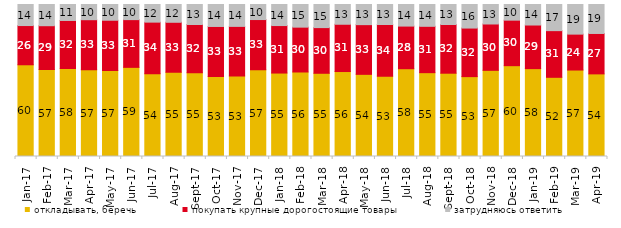
| Category | откладывать, беречь | покупать крупные дорогостоящие товары | затрудняюсь ответить |
|---|---|---|---|
| 2017-01-01 | 60.35 | 25.8 | 13.85 |
| 2017-02-01 | 56.8 | 28.6 | 13.85 |
| 2017-03-01 | 57.9 | 31.6 | 10.5 |
| 2017-04-01 | 57.1 | 32.85 | 10 |
| 2017-05-01 | 56.6 | 33.05 | 10.35 |
| 2017-06-01 | 58.65 | 31.4 | 9.95 |
| 2017-07-01 | 54.4 | 34 | 11.6 |
| 2017-08-01 | 55.4 | 32.9 | 11.7 |
| 2017-09-01 | 55.1 | 31.75 | 13.15 |
| 2017-10-01 | 52.6 | 32.95 | 14.45 |
| 2017-11-01 | 52.9 | 32.7 | 14.4 |
| 2017-12-01 | 57.1 | 33 | 9.9 |
| 2018-01-01 | 54.9 | 31.25 | 13.85 |
| 2018-02-01 | 55.6 | 29.5 | 14.9 |
| 2018-03-01 | 54.75 | 30.05 | 15.2 |
| 2018-04-01 | 55.9 | 31.1 | 13 |
| 2018-05-01 | 54.05 | 32.7 | 13.25 |
| 2018-06-01 | 52.85 | 34 | 13.15 |
| 2018-07-01 | 57.75 | 28.05 | 14.2 |
| 2018-08-01 | 55.15 | 30.5 | 14.35 |
| 2018-09-01 | 54.8 | 32.05 | 13.15 |
| 2018-10-01 | 52.55 | 31.95 | 15.5 |
| 2018-11-01 | 56.687 | 30.489 | 12.824 |
| 2018-12-01 | 59.75 | 29.95 | 10.3 |
| 2019-01-01 | 57.8 | 28.7 | 13.5 |
| 2019-02-01 | 52.1 | 30.7 | 17.2 |
| 2019-03-01 | 56.887 | 23.62 | 19.493 |
| 2019-04-01 | 54.356 | 26.584 | 19.059 |